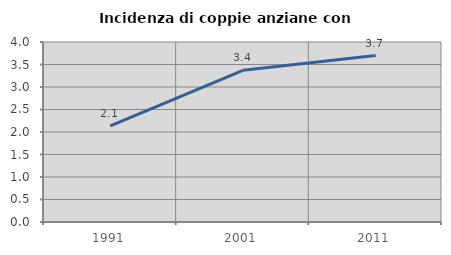
| Category | Incidenza di coppie anziane con figli |
|---|---|
| 1991.0 | 2.138 |
| 2001.0 | 3.372 |
| 2011.0 | 3.698 |